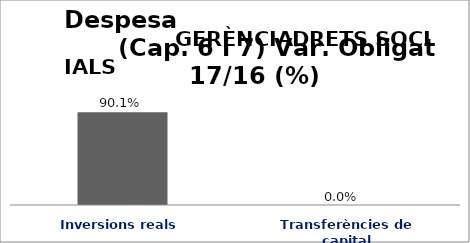
| Category | Series 0 |
|---|---|
| Inversions reals | 0.901 |
| Transferències de capital | 0 |